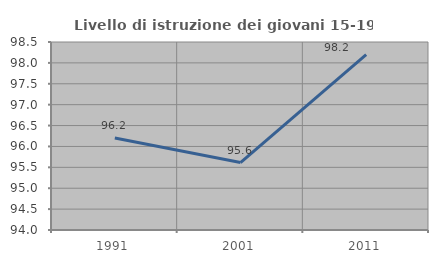
| Category | Livello di istruzione dei giovani 15-19 anni |
|---|---|
| 1991.0 | 96.203 |
| 2001.0 | 95.614 |
| 2011.0 | 98.198 |